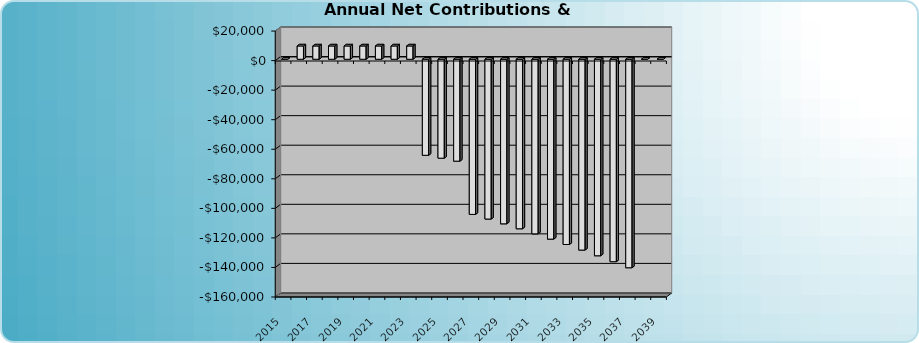
| Category | Annual Net Contributions & Withdrawals |
|---|---|
| 2015.0 | 0 |
| 2016.0 | 9000 |
| 2017.0 | 9000 |
| 2018.0 | 9000 |
| 2019.0 | 9000 |
| 2020.0 | 9000 |
| 2021.0 | 9000 |
| 2022.0 | 9000 |
| 2023.0 | 9000 |
| 2024.0 | -65000 |
| 2025.0 | -66950 |
| 2026.0 | -68958.5 |
| 2027.0 | -105000 |
| 2028.0 | -108150 |
| 2029.0 | -111394.5 |
| 2030.0 | -114736.335 |
| 2031.0 | -118178.425 |
| 2032.0 | -121723.778 |
| 2033.0 | -125375.491 |
| 2034.0 | -129136.756 |
| 2035.0 | -133010.859 |
| 2036.0 | -137001.184 |
| 2037.0 | -141111.22 |
| 2038.0 | 0 |
| 2039.0 | 0 |